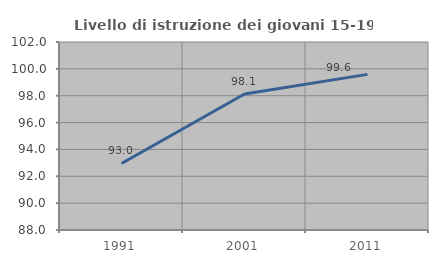
| Category | Livello di istruzione dei giovani 15-19 anni |
|---|---|
| 1991.0 | 92.956 |
| 2001.0 | 98.131 |
| 2011.0 | 99.589 |